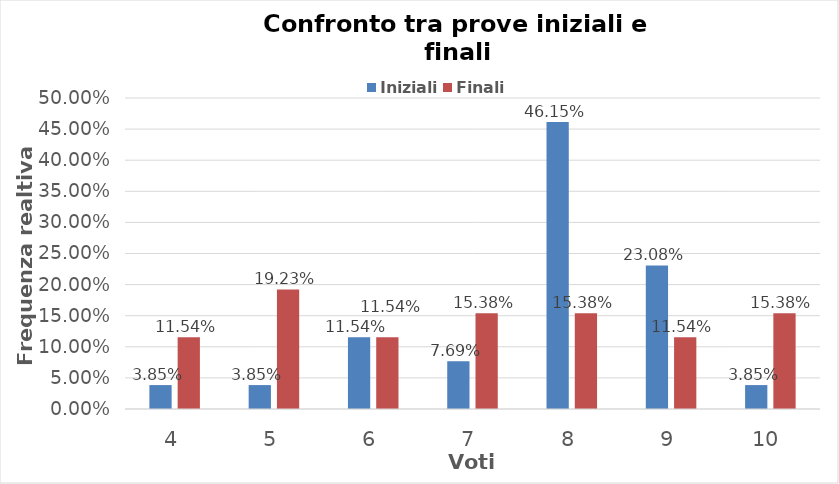
| Category | Iniziali | Finali |
|---|---|---|
| 4.0 | 0.038 | 0.115 |
| 5.0 | 0.038 | 0.192 |
| 6.0 | 0.115 | 0.115 |
| 7.0 | 0.077 | 0.154 |
| 8.0 | 0.462 | 0.154 |
| 9.0 | 0.231 | 0.115 |
| 10.0 | 0.038 | 0.154 |